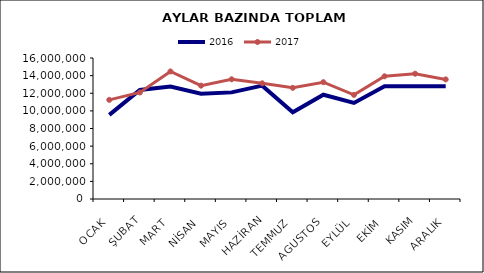
| Category | 2016 | 2017 |
|---|---|---|
| OCAK | 9546115.4 | 11249354 |
| ŞUBAT | 12366388.057 | 12091274 |
| MART | 12757672.093 | 14473887 |
| NİSAN | 11950497.685 | 12861395 |
| MAYIS | 12098611.067 | 13585046 |
| HAZİRAN | 12864154.06 | 13127944 |
| TEMMUZ | 9850124.872 | 12615027 |
| AGUSTOS | 11830762.82 | 13253678 |
| EYLÜL | 10901638.452 | 11814796 |
| EKİM | 12796159.91 | 13923512 |
| KASIM | 12786936.247 | 14216607 |
| ARALIK | 12780523.145 | 13569737.017 |